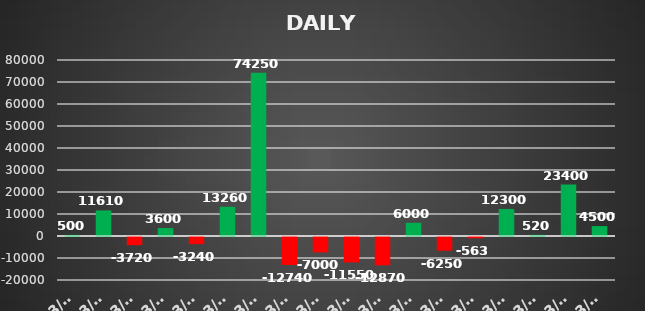
| Category | Series 0 |
|---|---|
| 2023-03-01 | 500 |
| 2023-03-02 | 11610 |
| 2023-03-03 | -3720 |
| 2023-03-06 | 3600 |
| 2023-03-13 | -3240 |
| 2023-03-14 | 13260 |
| 2023-03-15 | 74250 |
| 2023-03-17 | -12740 |
| 2023-03-20 | -7000 |
| 2023-03-21 | -11550 |
| 2023-03-22 | -12870 |
| 2023-03-23 | 6000 |
| 2023-03-24 | -6250 |
| 2023-03-27 | -562.5 |
| 2023-03-27 | 12300 |
| 2023-03-28 | 520 |
| 2023-03-29 | 23400 |
| 2023-03-31 | 4500 |